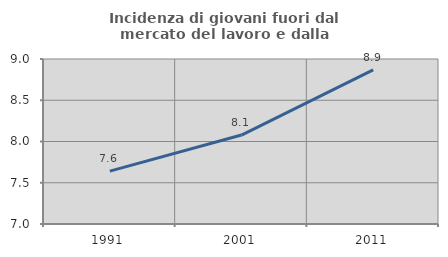
| Category | Incidenza di giovani fuori dal mercato del lavoro e dalla formazione  |
|---|---|
| 1991.0 | 7.64 |
| 2001.0 | 8.078 |
| 2011.0 | 8.869 |